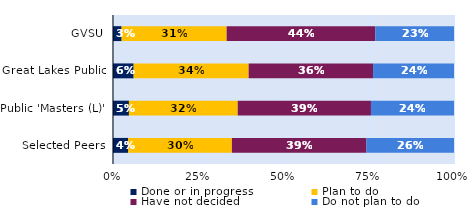
| Category | Done or in progress | Plan to do | Have not decided | Do not plan to do |
|---|---|---|---|---|
| GVSU | 0.025 | 0.308 | 0.436 | 0.231 |
| Great Lakes Public | 0.061 | 0.337 | 0.365 | 0.237 |
| Public 'Masters (L)' | 0.047 | 0.319 | 0.391 | 0.244 |
| Selected Peers | 0.045 | 0.304 | 0.395 | 0.257 |